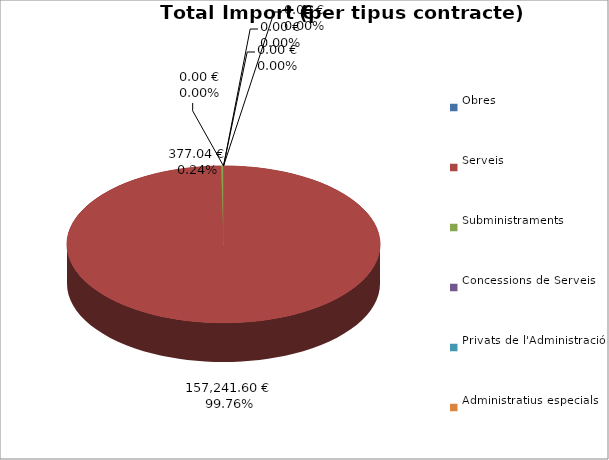
| Category | Total preu
(amb IVA) |
|---|---|
| Obres | 0 |
| Serveis | 157241.6 |
| Subministraments | 377.04 |
| Concessions de Serveis | 0 |
| Privats de l'Administració | 0 |
| Administratius especials | 0 |